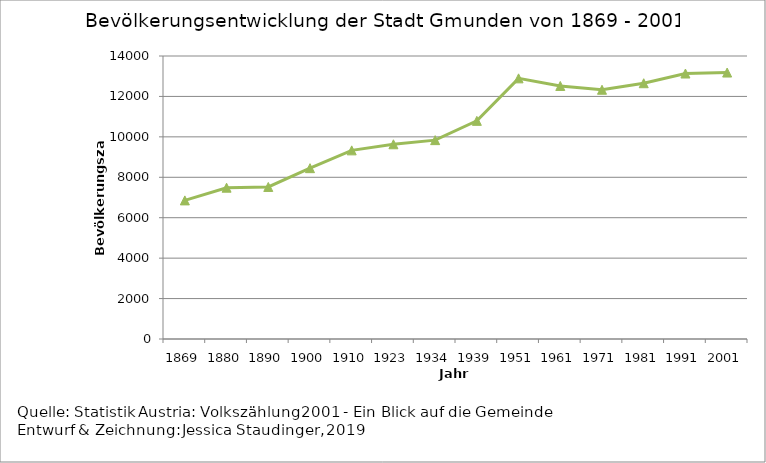
| Category | Series 2 |
|---|---|
| 1869 | 6857 |
| 1880 | 7485 |
| 1890 | 7521 |
| 1900 | 8451 |
| 1910 | 9332 |
| 1923 | 9633 |
| 1934 | 9838 |
| 1939 | 10792 |
| 1951 | 12894 |
| 1961 | 12518 |
| 1971 | 12331 |
| 1981 | 12653 |
| 1991 | 13133 |
| 2001 | 13182 |